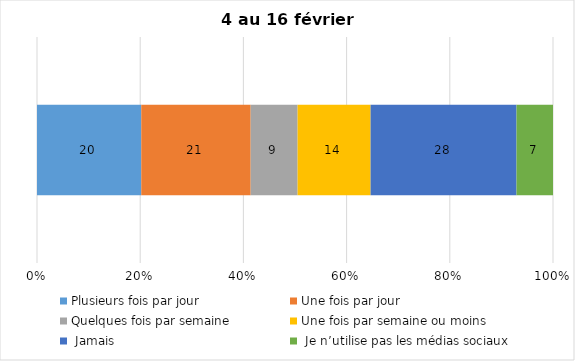
| Category | Plusieurs fois par jour | Une fois par jour | Quelques fois par semaine   | Une fois par semaine ou moins   |  Jamais   |  Je n’utilise pas les médias sociaux |
|---|---|---|---|---|---|---|
| 0 | 20 | 21 | 9 | 14 | 28 | 7 |